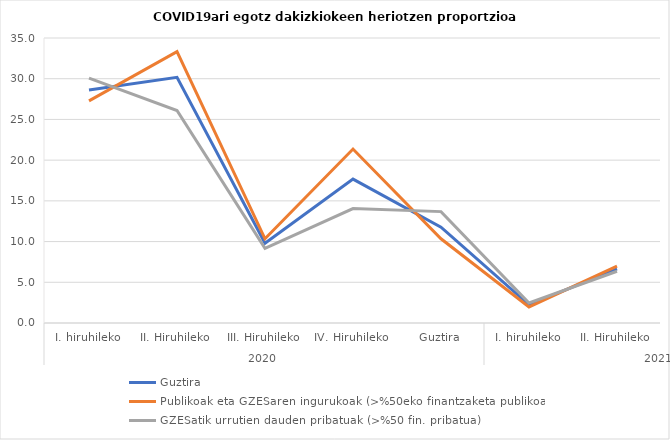
| Category | Guztira | Publikoak eta GZESaren ingurukoak (>%50eko finantzaketa publikoa) | GZESatik urrutien dauden pribatuak (>%50 fin. pribatua) |
|---|---|---|---|
| 0 | 28.62 | 27.273 | 30.07 |
| 1 | 30.168 | 33.333 | 26.093 |
| 2 | 9.789 | 10.345 | 9.165 |
| 3 | 17.673 | 21.364 | 14.06 |
| 4 | 11.769 | 10.345 | 13.678 |
| 5 | 2.239 | 1.967 | 2.466 |
| 6 | 6.65 | 6.977 | 6.353 |